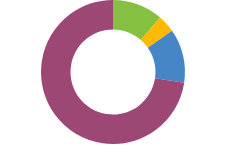
| Category | 43.300 lei |
|---|---|
| NUMERAR | 43300 |
| INVESTIȚII | 15000 |
| PENSIE | 46000 |
| PERSONAL | 276500 |